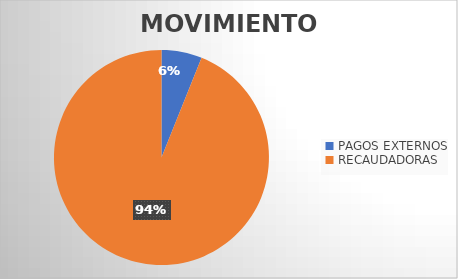
| Category | MOVIMIENTOS |
|---|---|
| PAGOS EXTERNOS | 1743 |
| RECAUDADORAS | 26918 |